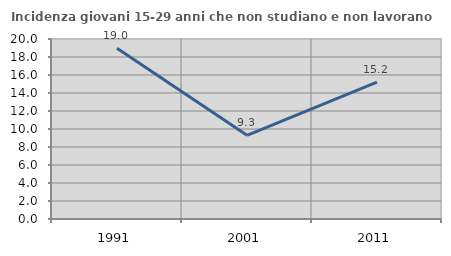
| Category | Incidenza giovani 15-29 anni che non studiano e non lavorano  |
|---|---|
| 1991.0 | 18.972 |
| 2001.0 | 9.296 |
| 2011.0 | 15.211 |